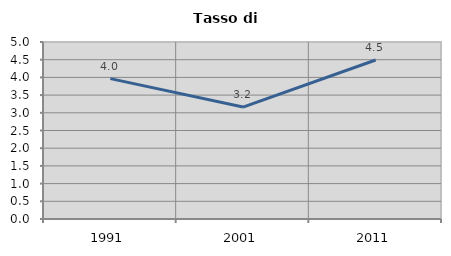
| Category | Tasso di disoccupazione   |
|---|---|
| 1991.0 | 3.966 |
| 2001.0 | 3.162 |
| 2011.0 | 4.492 |